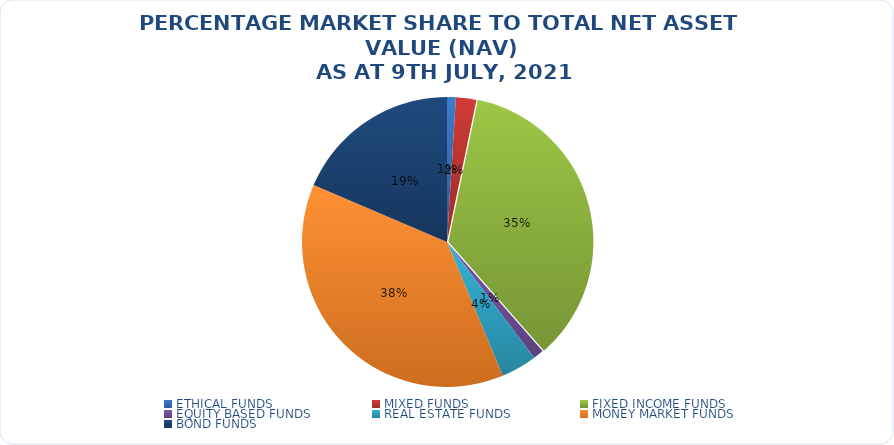
| Category | NET ASSET VALUE |
|---|---|
| ETHICAL FUNDS | 12447197716.011 |
| MIXED FUNDS | 28943512920.52 |
| FIXED INCOME FUNDS | 448850035849.367 |
| EQUITY BASED FUNDS | 15021890816.76 |
| REAL ESTATE FUNDS | 50815035001.09 |
| MONEY MARKET FUNDS | 479513324678.65 |
| BOND FUNDS | 236278059860.277 |